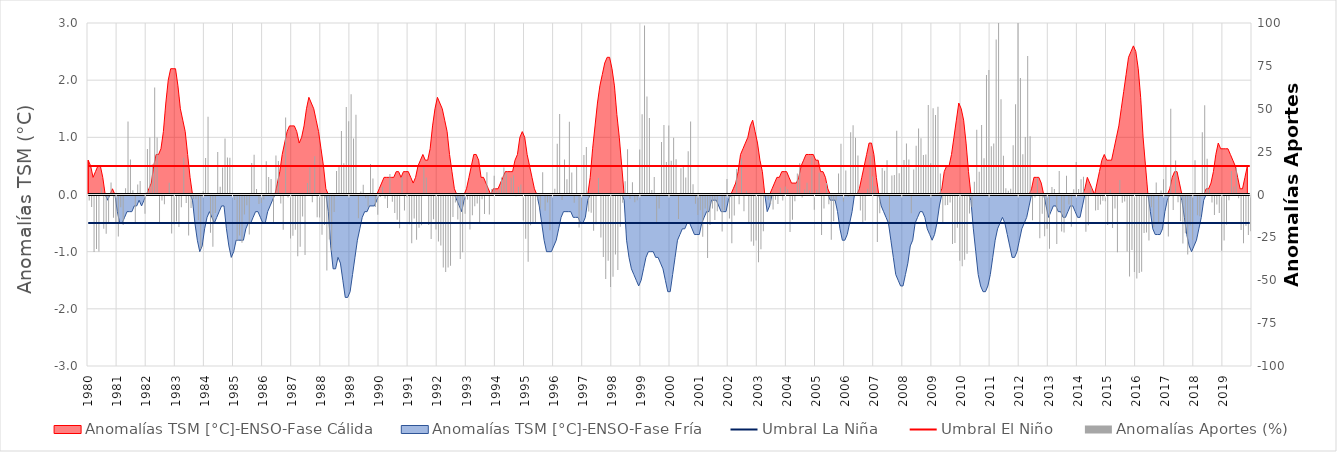
| Category | Anomalías Aportes (%) |
|---|---|
| 0 | -2.96 |
| 1 | -6.65 |
| 2 | -32.91 |
| 3 | -31.22 |
| 4 | -32.69 |
| 5 | 4.04 |
| 6 | -19.42 |
| 7 | -22.35 |
| 8 | -16.59 |
| 9 | 7.02 |
| 10 | -12.93 |
| 11 | -15.38 |
| 12 | -23.91 |
| 13 | -6.87 |
| 14 | -17.14 |
| 15 | 3.58 |
| 16 | 42.54 |
| 17 | 20.41 |
| 18 | 2.54 |
| 19 | -15.54 |
| 20 | 5.87 |
| 21 | 7.93 |
| 22 | 0.89 |
| 23 | -10.68 |
| 24 | 26.58 |
| 25 | 33.17 |
| 26 | 17.7 |
| 27 | 62.43 |
| 28 | 33.25 |
| 29 | -15.72 |
| 30 | -2.98 |
| 31 | -5.06 |
| 32 | -0.26 |
| 33 | 6.89 |
| 34 | -22.16 |
| 35 | -16.73 |
| 36 | -15.21 |
| 37 | -18.44 |
| 38 | -6.8 |
| 39 | 21.37 |
| 40 | -4.4 |
| 41 | -23.31 |
| 42 | -7.22 |
| 43 | -2.01 |
| 44 | -2.18 |
| 45 | -14.49 |
| 46 | -31.14 |
| 47 | 1.85 |
| 48 | 21.28 |
| 49 | 45.3 |
| 50 | -21.75 |
| 51 | -29.86 |
| 52 | -10.21 |
| 53 | 24.8 |
| 54 | 4.56 |
| 55 | 15.72 |
| 56 | 32.71 |
| 57 | 21.58 |
| 58 | 21.38 |
| 59 | -0.7 |
| 60 | -2.57 |
| 61 | -26.3 |
| 62 | -23.34 |
| 63 | -27.51 |
| 64 | -11.14 |
| 65 | -5.73 |
| 66 | -22.79 |
| 67 | 18.3 |
| 68 | 23.13 |
| 69 | 3.23 |
| 70 | -5.02 |
| 71 | -4.34 |
| 72 | -2.4 |
| 73 | 19.45 |
| 74 | 10.15 |
| 75 | 8.98 |
| 76 | -16.62 |
| 77 | 22.73 |
| 78 | 19.6 |
| 79 | -4.63 |
| 80 | -19.9 |
| 81 | 44.84 |
| 82 | -1.12 |
| 83 | -25.06 |
| 84 | -23.43 |
| 85 | -19.94 |
| 86 | -35.36 |
| 87 | -29.94 |
| 88 | -12.31 |
| 89 | -34.73 |
| 90 | 6.76 |
| 91 | 16.97 |
| 92 | -3.94 |
| 93 | 22.32 |
| 94 | -12.71 |
| 95 | -12.76 |
| 96 | -22.9 |
| 97 | -17.21 |
| 98 | -43.68 |
| 99 | -25.67 |
| 100 | -32.05 |
| 101 | -9.55 |
| 102 | 13.65 |
| 103 | 16.23 |
| 104 | 37.09 |
| 105 | 18.27 |
| 106 | 51.03 |
| 107 | 42.66 |
| 108 | 58.47 |
| 109 | 32.61 |
| 110 | 46.47 |
| 111 | -13.29 |
| 112 | 1.69 |
| 113 | 5.63 |
| 114 | -1.6 |
| 115 | -6.52 |
| 116 | 17.73 |
| 117 | 9.33 |
| 118 | -6.7 |
| 119 | -11.24 |
| 120 | -0.86 |
| 121 | 4.59 |
| 122 | -1.69 |
| 123 | -7.25 |
| 124 | 12.01 |
| 125 | -3.7 |
| 126 | -10.18 |
| 127 | -14.21 |
| 128 | -19.06 |
| 129 | 10.4 |
| 130 | -8.69 |
| 131 | -1.04 |
| 132 | -16.76 |
| 133 | -27.83 |
| 134 | -13.43 |
| 135 | -25.85 |
| 136 | -18.85 |
| 137 | -17.36 |
| 138 | 16.13 |
| 139 | 9.88 |
| 140 | -17.15 |
| 141 | -25.31 |
| 142 | -13.88 |
| 143 | -19.84 |
| 144 | -26.81 |
| 145 | -29.17 |
| 146 | -41.97 |
| 147 | -44.66 |
| 148 | -41.98 |
| 149 | -40.96 |
| 150 | -12.58 |
| 151 | -4.02 |
| 152 | -13.93 |
| 153 | -36.97 |
| 154 | -33.13 |
| 155 | -10.63 |
| 156 | -2.32 |
| 157 | -19.83 |
| 158 | -11.47 |
| 159 | -6.27 |
| 160 | -4.65 |
| 161 | -16.16 |
| 162 | -2.15 |
| 163 | -10.84 |
| 164 | 13.04 |
| 165 | -11.06 |
| 166 | 3.23 |
| 167 | 10.94 |
| 168 | 1.81 |
| 169 | 2.5 |
| 170 | 9.85 |
| 171 | 15.8 |
| 172 | 12.75 |
| 173 | 1.09 |
| 174 | 9.73 |
| 175 | 11.21 |
| 176 | -0.39 |
| 177 | 4.49 |
| 178 | 5.84 |
| 179 | -14.53 |
| 180 | -25.25 |
| 181 | -38.69 |
| 182 | -17.3 |
| 183 | -16.17 |
| 184 | -15.66 |
| 185 | -2.36 |
| 186 | -7.51 |
| 187 | 12.97 |
| 188 | -8.84 |
| 189 | -4.08 |
| 190 | -20.3 |
| 191 | 0.26 |
| 192 | 3.28 |
| 193 | 29.59 |
| 194 | 46.99 |
| 195 | -2.68 |
| 196 | 20.45 |
| 197 | 8.96 |
| 198 | 42.47 |
| 199 | 12.78 |
| 200 | -4.19 |
| 201 | 17.02 |
| 202 | -18.69 |
| 203 | -8.56 |
| 204 | 23 |
| 205 | 27.69 |
| 206 | -9.28 |
| 207 | -10.05 |
| 208 | -20.59 |
| 209 | -16.81 |
| 210 | 9.56 |
| 211 | -24.47 |
| 212 | -35.84 |
| 213 | -48.67 |
| 214 | -37.99 |
| 215 | -53.28 |
| 216 | -47.43 |
| 217 | -34.36 |
| 218 | -43.38 |
| 219 | -18.2 |
| 220 | -4.16 |
| 221 | 7.71 |
| 222 | 26.33 |
| 223 | -2.07 |
| 224 | 7.14 |
| 225 | -3.89 |
| 226 | -2.78 |
| 227 | 26.31 |
| 228 | 46.82 |
| 229 | 98.57 |
| 230 | 57.13 |
| 231 | 44.61 |
| 232 | 2.66 |
| 233 | 10.26 |
| 234 | -15.71 |
| 235 | -7.62 |
| 236 | 30.65 |
| 237 | 40.53 |
| 238 | 18.96 |
| 239 | 40.29 |
| 240 | 19.62 |
| 241 | 33.06 |
| 242 | 20.6 |
| 243 | -13.65 |
| 244 | 15.37 |
| 245 | 16.35 |
| 246 | 9.94 |
| 247 | 25.19 |
| 248 | 42.6 |
| 249 | 5.91 |
| 250 | -4.8 |
| 251 | -11.31 |
| 252 | -8.62 |
| 253 | -24.11 |
| 254 | -7.61 |
| 255 | -36.42 |
| 256 | -17.14 |
| 257 | -7.51 |
| 258 | -14.29 |
| 259 | -9.13 |
| 260 | 0.54 |
| 261 | -21.04 |
| 262 | -8.58 |
| 263 | 9.04 |
| 264 | -13.41 |
| 265 | -27.89 |
| 266 | -11.64 |
| 267 | 14.88 |
| 268 | -5.17 |
| 269 | 21.11 |
| 270 | -9.18 |
| 271 | 2.25 |
| 272 | -16.2 |
| 273 | -26.89 |
| 274 | -29.31 |
| 275 | -26.17 |
| 276 | -38.86 |
| 277 | -31.4 |
| 278 | -20.8 |
| 279 | -0.14 |
| 280 | -2.41 |
| 281 | -4.92 |
| 282 | -8.19 |
| 283 | -2.49 |
| 284 | -4.94 |
| 285 | 3.92 |
| 286 | -2.94 |
| 287 | 4.64 |
| 288 | 2.99 |
| 289 | -21.35 |
| 290 | -14.12 |
| 291 | -3.4 |
| 292 | 12.2 |
| 293 | 18.21 |
| 294 | -1.23 |
| 295 | 2.94 |
| 296 | 6.91 |
| 297 | 2.36 |
| 298 | 21.99 |
| 299 | -8.24 |
| 300 | 2.74 |
| 301 | 12.7 |
| 302 | -22.96 |
| 303 | -7.59 |
| 304 | 6.77 |
| 305 | -5.11 |
| 306 | -25.81 |
| 307 | -14.95 |
| 308 | -3.04 |
| 309 | 12.18 |
| 310 | 29.53 |
| 311 | -3.44 |
| 312 | 14.05 |
| 313 | -0.82 |
| 314 | 36.28 |
| 315 | 40.4 |
| 316 | 33.12 |
| 317 | 22.69 |
| 318 | -8.8 |
| 319 | -15.52 |
| 320 | -14.63 |
| 321 | 3.39 |
| 322 | 22.43 |
| 323 | 10.55 |
| 324 | 4.97 |
| 325 | -27.12 |
| 326 | -10.4 |
| 327 | 15.48 |
| 328 | 13.89 |
| 329 | 19.95 |
| 330 | -16.99 |
| 331 | 11.02 |
| 332 | 11.4 |
| 333 | 37.13 |
| 334 | 12.44 |
| 335 | 16.53 |
| 336 | 20.18 |
| 337 | 29.79 |
| 338 | 20.43 |
| 339 | -10.4 |
| 340 | 14.6 |
| 341 | 28.42 |
| 342 | 38.5 |
| 343 | 32.84 |
| 344 | 23.02 |
| 345 | 23.34 |
| 346 | 52.15 |
| 347 | 18.29 |
| 348 | 50.22 |
| 349 | 46.39 |
| 350 | 51.2 |
| 351 | 12.28 |
| 352 | -15.53 |
| 353 | -5.72 |
| 354 | -5.57 |
| 355 | -4.15 |
| 356 | -28.27 |
| 357 | -27.65 |
| 358 | -18.74 |
| 359 | -38 |
| 360 | -41.22 |
| 361 | -37.4 |
| 362 | -33.92 |
| 363 | -10.52 |
| 364 | -6.84 |
| 365 | 7.49 |
| 366 | 37.75 |
| 367 | 13.23 |
| 368 | 40.58 |
| 369 | 21.11 |
| 370 | 69.63 |
| 371 | 72.58 |
| 372 | 28.19 |
| 373 | 29.79 |
| 374 | 90.43 |
| 375 | 137.47 |
| 376 | 55.51 |
| 377 | 22.56 |
| 378 | 3.58 |
| 379 | 2.13 |
| 380 | 3.38 |
| 381 | 28.77 |
| 382 | 52.68 |
| 383 | 103.47 |
| 384 | 67.9 |
| 385 | 23.42 |
| 386 | 33.54 |
| 387 | 80.7 |
| 388 | 33.9 |
| 389 | -14.41 |
| 390 | -1.21 |
| 391 | 9.6 |
| 392 | -24.94 |
| 393 | -10.65 |
| 394 | -23.72 |
| 395 | -19.39 |
| 396 | -31.04 |
| 397 | 4.34 |
| 398 | 3.22 |
| 399 | -28.22 |
| 400 | 13.7 |
| 401 | -21.03 |
| 402 | -21.54 |
| 403 | 11 |
| 404 | -5.26 |
| 405 | -18.19 |
| 406 | 3.1 |
| 407 | 19.01 |
| 408 | 3.18 |
| 409 | 8.85 |
| 410 | 10.33 |
| 411 | -21.14 |
| 412 | -17.3 |
| 413 | 4.42 |
| 414 | -0.09 |
| 415 | -8.69 |
| 416 | -8.48 |
| 417 | -5.29 |
| 418 | -2.99 |
| 419 | -3.37 |
| 420 | -17.15 |
| 421 | 2.74 |
| 422 | -18.89 |
| 423 | -7.6 |
| 424 | -33.03 |
| 425 | 8.42 |
| 426 | -4.19 |
| 427 | -3.53 |
| 428 | -32.61 |
| 429 | -47.16 |
| 430 | -31.82 |
| 431 | -44.65 |
| 432 | -48.42 |
| 433 | -45.22 |
| 434 | -44.47 |
| 435 | -21.85 |
| 436 | -21.55 |
| 437 | -26.23 |
| 438 | -6.82 |
| 439 | -18.47 |
| 440 | 6.96 |
| 441 | -16.15 |
| 442 | 2.28 |
| 443 | 8.92 |
| 444 | 16.26 |
| 445 | -23.95 |
| 446 | 50.01 |
| 447 | -8.45 |
| 448 | 19.89 |
| 449 | -3.96 |
| 450 | -15.07 |
| 451 | -27.99 |
| 452 | -22.07 |
| 453 | -34.47 |
| 454 | -17.44 |
| 455 | -26 |
| 456 | 19.92 |
| 457 | -11.49 |
| 458 | -12.14 |
| 459 | 36.3 |
| 460 | 52 |
| 461 | 20.88 |
| 462 | 3.26 |
| 463 | -4.108 |
| 464 | -11.3 |
| 465 | -5.21 |
| 466 | -10.18 |
| 467 | -32.2 |
| 468 | -26.17 |
| 469 | -16.86 |
| 470 | -2.74 |
| 471 | 13.66 |
| 472 | 4.72 |
| 473 | 15.81 |
| 474 | -1.61 |
| 475 | -20.13 |
| 476 | -27.82 |
| 477 | -17.67 |
| 478 | -23.01 |
| 479 | -20.87 |